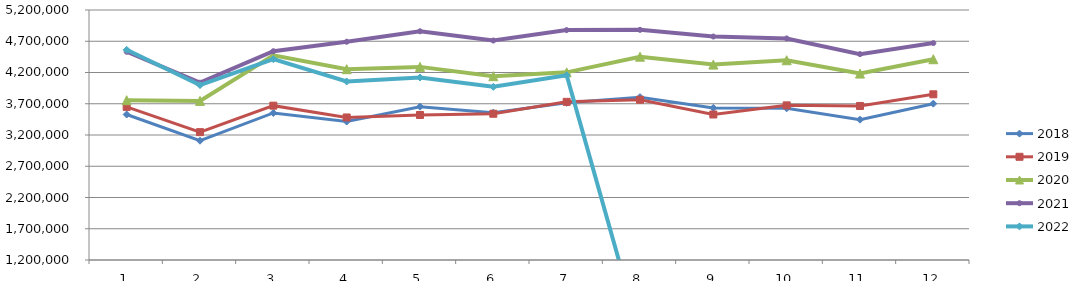
| Category | 2018 | 2019 | 2020 | 2021 | 2022 |
|---|---|---|---|---|---|
| 0 | 3528241.229 | 3649683.28 | 3756283.089 | 4531541.153 | 4563200.653 |
| 1 | 3108555.552 | 3245578.859 | 3745626.569 | 4037286.037 | 3998277.306 |
| 2 | 3553184.371 | 3669368.201 | 4474226.706 | 4540804.564 | 4412666.056 |
| 3 | 3414889.226 | 3480737.518 | 4252877.011 | 4692178.419 | 4056919.979 |
| 4 | 3653293.789 | 3520173.393 | 4289935.067 | 4859630.691 | 4119689.336 |
| 5 | 3557351.211 | 3540194.304 | 4141054.684 | 4711532.98 | 3970674.322 |
| 6 | 3714873.235 | 3730287.221 | 4202654.044 | 4878717.093 | 4155002.375 |
| 7 | 3805404.89 | 3764065.715 | 4452839.823 | 4882258.316 | 0 |
| 8 | 3633589.924 | 3528193.213 | 4326562.065 | 4775380.064 | 0 |
| 9 | 3626810.501 | 3674095.651 | 4396335.731 | 4744279.495 | 0 |
| 10 | 3445044.438 | 3664597.161 | 4182792.836 | 4494280.792 | 0 |
| 11 | 3701418.855 | 3851208.606 | 4412374.456 | 4670500.878 | 0 |